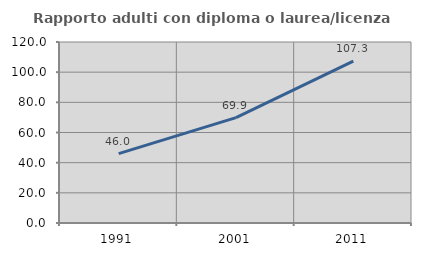
| Category | Rapporto adulti con diploma o laurea/licenza media  |
|---|---|
| 1991.0 | 46.026 |
| 2001.0 | 69.899 |
| 2011.0 | 107.35 |